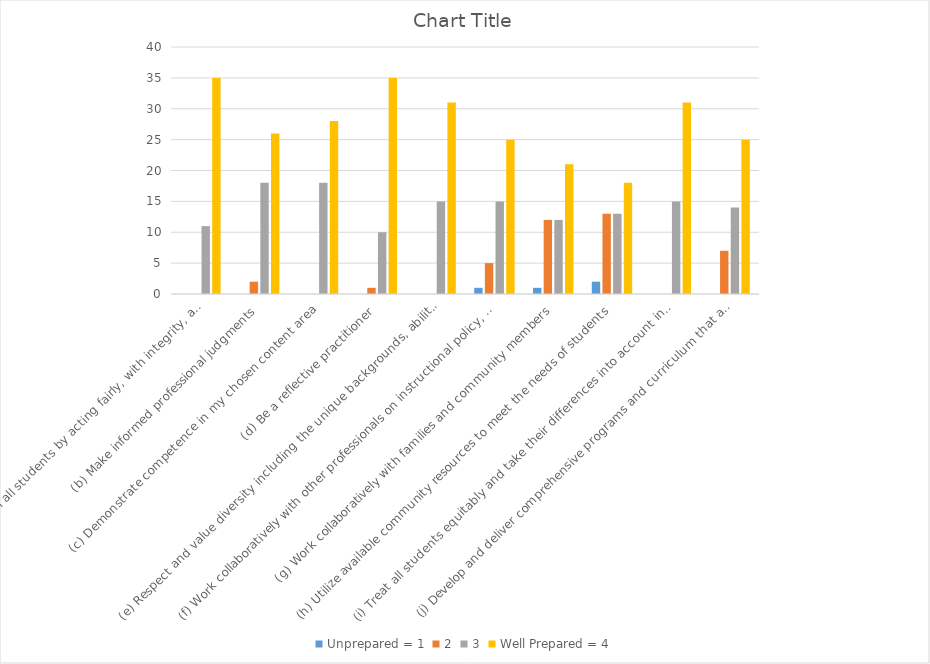
| Category | Unprepared = 1 | 2 | 3 | Well Prepared = 4 |
|---|---|---|---|---|
| (a) Promote the success of all students by acting fairly, with integrity, and in an ethical manner | 0 | 0 | 11 | 35 |
| (b) Make informed professional judgments | 0 | 2 | 18 | 26 |
| (c) Demonstrate competence in my chosen content area | 0 | 0 | 18 | 28 |
| (d) Be a reflective practitioner | 0 | 1 | 10 | 35 |
| (e) Respect and value diversity including the unique backgrounds, abilities, and interests of all students | 0 | 0 | 15 | 31 |
| (f) Work collaboratively with other professionals on instructional policy, curriculum development, and staff development | 1 | 5 | 15 | 25 |
| (g) Work collaboratively with families and community members | 1 | 12 | 12 | 21 |
| (h) Utilize available community resources to meet the needs of students | 2 | 13 | 13 | 18 |
| (i) Treat all students equitably and take their differences into account in professional practice | 0 | 0 | 15 | 31 |
| (j) Develop and deliver comprehensive programs and curriculum that advance the mission of the school | 0 | 7 | 14 | 25 |